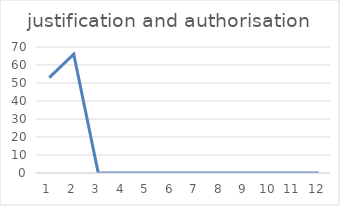
| Category | justification and authorisation |
|---|---|
| 0 | 53 |
| 1 | 66 |
| 2 | 0 |
| 3 | 0 |
| 4 | 0 |
| 5 | 0 |
| 6 | 0 |
| 7 | 0 |
| 8 | 0 |
| 9 | 0 |
| 10 | 0 |
| 11 | 0 |